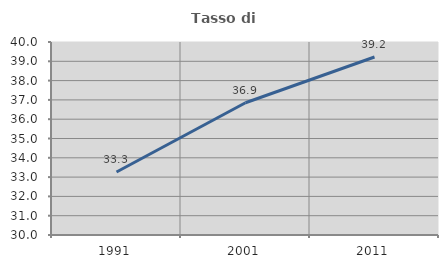
| Category | Tasso di occupazione   |
|---|---|
| 1991.0 | 33.266 |
| 2001.0 | 36.853 |
| 2011.0 | 39.222 |